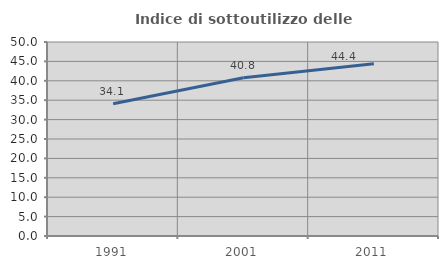
| Category | Indice di sottoutilizzo delle abitazioni  |
|---|---|
| 1991.0 | 34.06 |
| 2001.0 | 40.785 |
| 2011.0 | 44.372 |